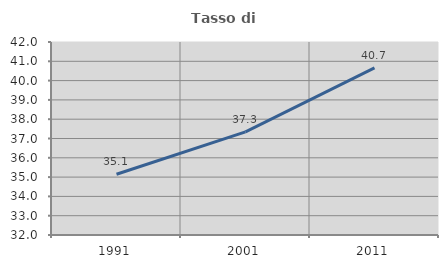
| Category | Tasso di occupazione   |
|---|---|
| 1991.0 | 35.145 |
| 2001.0 | 37.345 |
| 2011.0 | 40.66 |